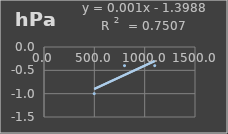
| Category | Presión Admosferica |
|---|---|
| 499.0 | -1 |
| 799.8 | -0.4 |
| 1099.8 | -0.4 |